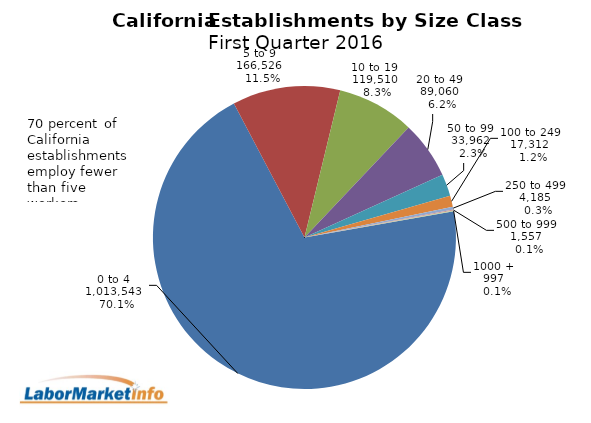
| Category | business |
|---|---|
| 0 to 4   | 1013543 |
| 5 to 9   | 166526 |
| 10 to 19   | 119510 |
| 20 to 49   | 89060 |
| 50 to 99   | 33962 |
| 100 to 249   | 17312 |
| 250 to 499   | 4185 |
| 500 to 999   | 1557 |
| 1000 +   | 997 |